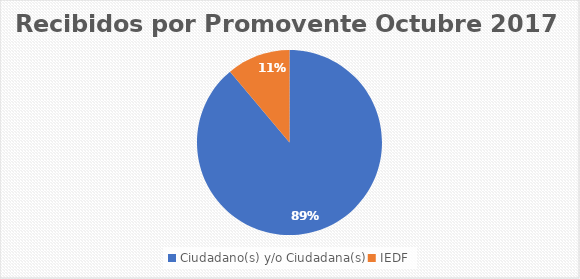
| Category | Series 0 |
|---|---|
| Ciudadano(s) y/o Ciudadana(s) | 16 |
| IEDF | 2 |